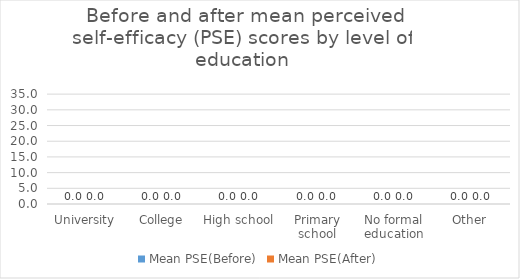
| Category | Mean PSE(Before) | Mean PSE(After) |
|---|---|---|
| University | 0 | 0 |
| College | 0 | 0 |
| High school | 0 | 0 |
| Primary school | 0 | 0 |
| No formal education | 0 | 0 |
| Other | 0 | 0 |